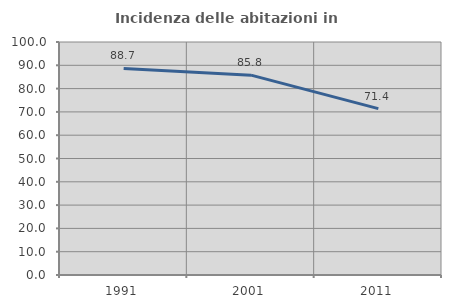
| Category | Incidenza delle abitazioni in proprietà  |
|---|---|
| 1991.0 | 88.675 |
| 2001.0 | 85.779 |
| 2011.0 | 71.398 |